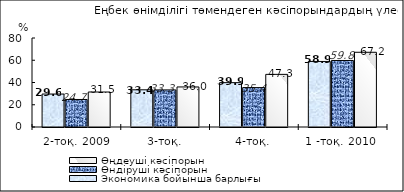
| Category | Экономика бойынша барлығы | Өндіруші кәсіпорын | Өңдеуші кәсіпорын |
|---|---|---|---|
| 2-тоқ. 2009 | 29.625 | 24.742 | 31.453 |
| 3-тоқ. | 33.439 | 33.333 | 36.009 |
| 4-тоқ. | 39.86 | 35.417 | 47.312 |
| 1 -тоқ. 2010  | 58.932 | 59.794 | 67.171 |